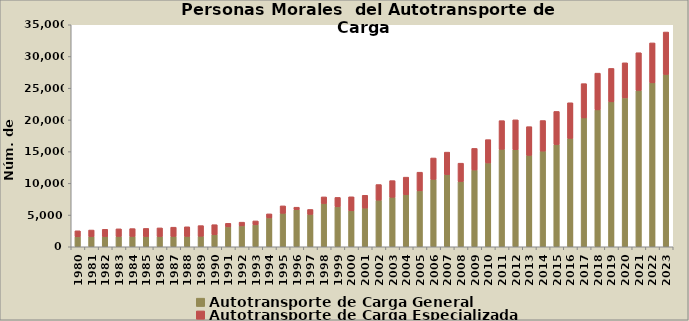
| Category | Autotransporte de Carga General | Autotransporte de Carga Especializada |
|---|---|---|
| 1980.0 | 1569 | 949 |
| 1981.0 | 1596 | 1046 |
| 1982.0 | 1602 | 1150 |
| 1983.0 | 1627 | 1200 |
| 1984.0 | 1626 | 1239 |
| 1985.0 | 1606 | 1289 |
| 1986.0 | 1609 | 1366 |
| 1987.0 | 1631 | 1456 |
| 1988.0 | 1633 | 1516 |
| 1989.0 | 1662 | 1675 |
| 1990.0 | 1892 | 1590 |
| 1991.0 | 3137 | 563 |
| 1992.0 | 3290 | 590 |
| 1993.0 | 3459 | 617 |
| 1994.0 | 4545 | 642 |
| 1995.0 | 5278 | 1171 |
| 1996.0 | 5841 | 398 |
| 1997.0 | 5107 | 776 |
| 1998.0 | 6812 | 1052 |
| 1999.0 | 6297 | 1486 |
| 2000.0 | 5669 | 2211 |
| 2001.0 | 6101 | 2017 |
| 2002.0 | 7351 | 2459 |
| 2003.0 | 7805 | 2627 |
| 2004.0 | 8202 | 2776 |
| 2005.0 | 8815 | 2943 |
| 2006.0 | 10632 | 3366 |
| 2007.0 | 11373 | 3550 |
| 2008.0 | 10287 | 2894 |
| 2009.0 | 12098 | 3412 |
| 2010.0 | 13210 | 3682 |
| 2011.0 | 15370 | 4517 |
| 2012.0 | 15298 | 4716 |
| 2013.0 | 14416 | 4521 |
| 2014.0 | 15084 | 4819 |
| 2015.0 | 16109 | 5228 |
| 2016.0 | 17082 | 5622 |
| 2017.0 | 20319 | 5401 |
| 2018.0 | 21582 | 5792 |
| 2019.0 | 22849 | 5272 |
| 2020.0 | 23471 | 5532 |
| 2021.0 | 24655 | 5936 |
| 2022.0 | 25846 | 6295 |
| 2023.0 | 27163 | 6694 |